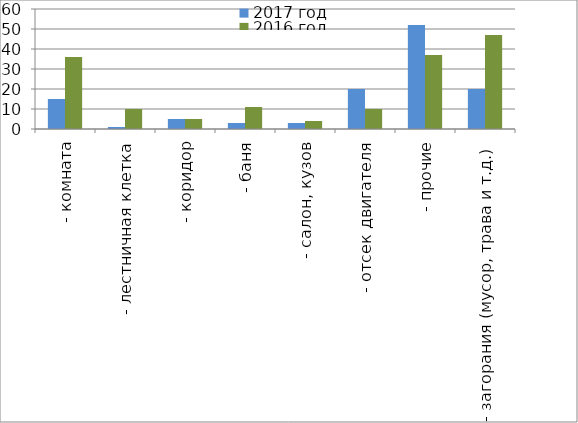
| Category | 2017 год | 2016 год |
|---|---|---|
|  - комната | 15 | 36 |
|  - лестничная клетка | 1 | 10 |
|  - коридор | 5 | 5 |
|  - баня | 3 | 11 |
|  - салон, кузов | 3 | 4 |
|  - отсек двигателя | 20 | 10 |
| - прочие | 52 | 37 |
| - загорания (мусор, трава и т.д.)  | 20 | 47 |